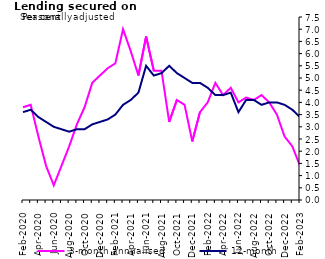
| Category | 3-month annualised | 12-month |
|---|---|---|
| Feb-2020 | 3.8 | 3.6 |
| Mar-2020 | 3.9 | 3.7 |
| Apr-2020 | 2.6 | 3.4 |
| May-2020 | 1.4 | 3.2 |
| Jun-2020 | 0.6 | 3 |
| Jul-2020 | 1.4 | 2.9 |
| Aug-2020 | 2.2 | 2.8 |
| Sep-2020 | 3.1 | 2.9 |
| Oct-2020 | 3.8 | 2.9 |
| Nov-2020 | 4.8 | 3.1 |
| Dec-2020 | 5.1 | 3.2 |
| Jan-2021 | 5.4 | 3.3 |
| Feb-2021 | 5.6 | 3.5 |
| Mar-2021 | 7 | 3.9 |
| Apr-2021 | 6.1 | 4.1 |
| May-2021 | 5.1 | 4.4 |
| Jun-2021 | 6.7 | 5.5 |
| Jul-2021 | 5.3 | 5.1 |
| Aug-2021 | 5.3 | 5.2 |
| Sep-2021 | 3.2 | 5.5 |
| Oct-2021 | 4.1 | 5.2 |
| Nov-2021 | 3.9 | 5 |
| Dec-2021 | 2.4 | 4.8 |
| Jan-2022 | 3.6 | 4.8 |
| Feb-2022 | 4 | 4.6 |
| Mar-2022 | 4.8 | 4.3 |
| Apr-2022 | 4.3 | 4.3 |
| May-2022 | 4.6 | 4.4 |
| Jun-2022 | 4 | 3.6 |
| Jul-2022 | 4.2 | 4.1 |
| Aug-2022 | 4.1 | 4.1 |
| Sep-2022 | 4.3 | 3.9 |
| Oct-2022 | 4 | 4 |
| Nov-2022 | 3.5 | 4 |
| Dec-2022 | 2.6 | 3.9 |
| Jan-2023 | 2.2 | 3.7 |
| Feb-2023 | 1.4 | 3.4 |